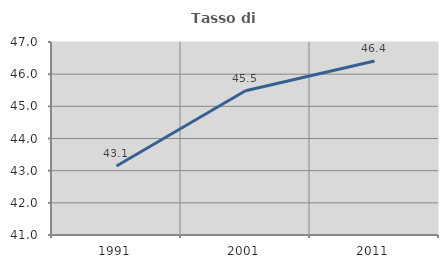
| Category | Tasso di occupazione   |
|---|---|
| 1991.0 | 43.143 |
| 2001.0 | 45.482 |
| 2011.0 | 46.41 |